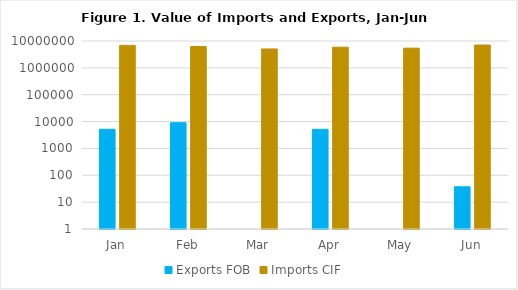
| Category | Exports FOB | Imports CIF  |
|---|---|---|
| Jan | 5171.76 | 6870419.14 |
| Feb | 9080.28 | 6201710.92 |
| Mar | 0 | 5063338.41 |
| Apr | 5154.55 | 5884847.96 |
| May | 0 | 5410140.62 |
| Jun | 37.29 | 7067501.09 |